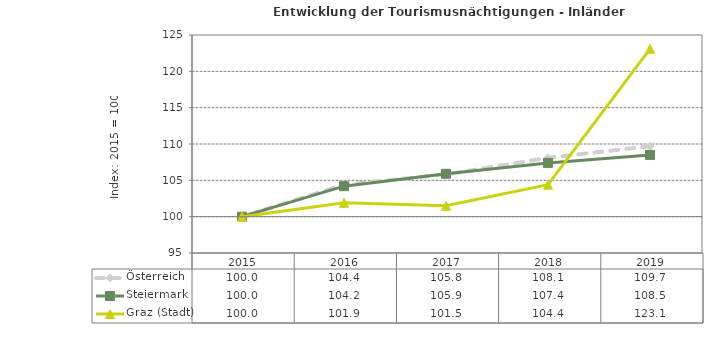
| Category | Österreich | Steiermark | Graz (Stadt) |
|---|---|---|---|
| 2019.0 | 109.7 | 108.5 | 123.1 |
| 2018.0 | 108.1 | 107.4 | 104.4 |
| 2017.0 | 105.8 | 105.9 | 101.5 |
| 2016.0 | 104.4 | 104.2 | 101.9 |
| 2015.0 | 100 | 100 | 100 |